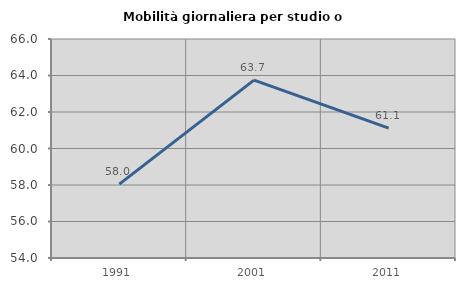
| Category | Mobilità giornaliera per studio o lavoro |
|---|---|
| 1991.0 | 58.048 |
| 2001.0 | 63.744 |
| 2011.0 | 61.119 |